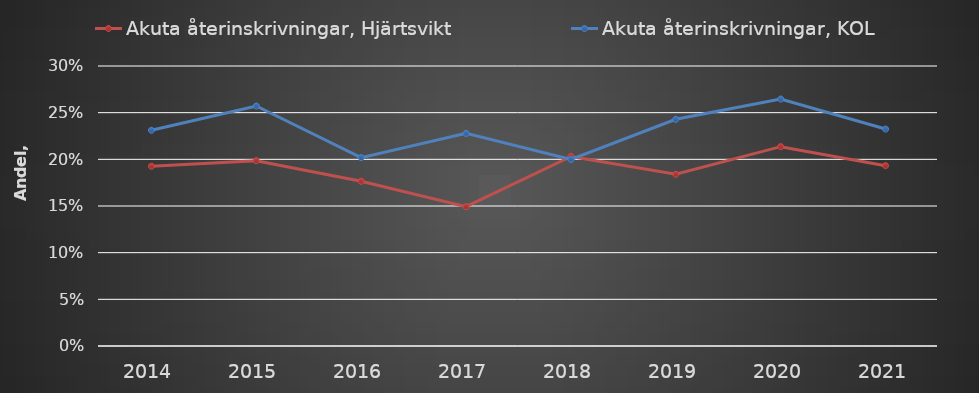
| Category | Akuta återinskrivningar, Hjärtsvikt | Akuta återinskrivningar, KOL  |
|---|---|---|
| 2014 | 0.193 | 0.231 |
| 2015 | 0.199 | 0.257 |
| 2016 | 0.177 | 0.202 |
| 2017 | 0.149 | 0.228 |
| 2018 | 0.203 | 0.2 |
| 2019 | 0.184 | 0.243 |
| 2020 | 0.214 | 0.265 |
| 2021 | 0.193 | 0.232 |